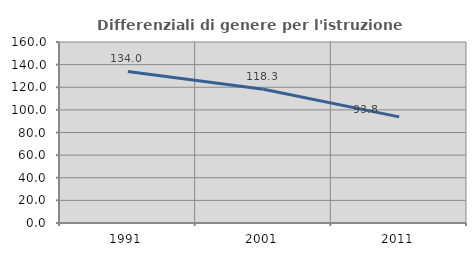
| Category | Differenziali di genere per l'istruzione superiore |
|---|---|
| 1991.0 | 134.013 |
| 2001.0 | 118.256 |
| 2011.0 | 93.823 |